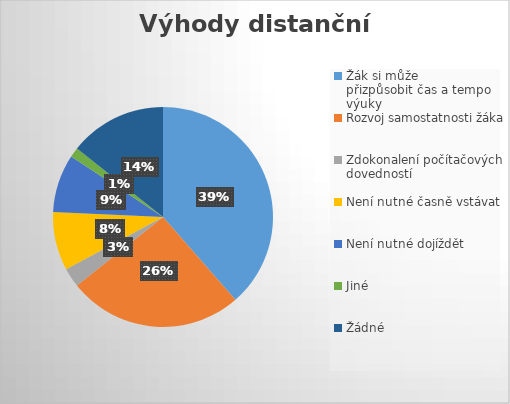
| Category | Series 0 |
|---|---|
| Žák si může přizpůsobit čas a tempo výuky | 27 |
| Rozvoj samostatnosti žáka | 18 |
| Zdokonalení počítačových dovedností | 2 |
| Není nutné časně vstávat | 6 |
| Není nutné dojíždět | 6 |
| Jiné | 1 |
| Žádné | 10 |